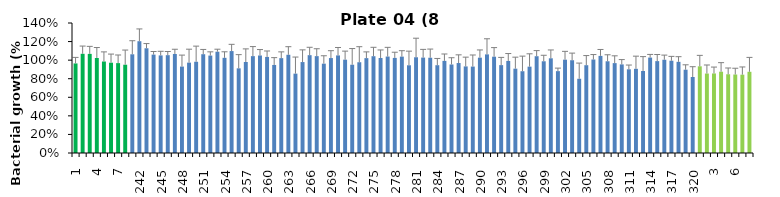
| Category | 8 h % |
|---|---|
| 1.0 | 0.965 |
| 2.0 | 1.068 |
| 3.0 | 1.067 |
| 4.0 | 1.023 |
| 5.0 | 0.985 |
| 6.0 | 0.972 |
| 7.0 | 0.968 |
| 8.0 | 0.951 |
| 241.0 | 1.063 |
| 242.0 | 1.204 |
| 243.0 | 1.128 |
| 244.0 | 1.06 |
| 245.0 | 1.051 |
| 246.0 | 1.054 |
| 247.0 | 1.067 |
| 248.0 | 0.931 |
| 249.0 | 0.973 |
| 250.0 | 0.983 |
| 251.0 | 1.064 |
| 252.0 | 1.049 |
| 253.0 | 1.091 |
| 254.0 | 1.025 |
| 255.0 | 1.098 |
| 256.0 | 0.912 |
| 257.0 | 0.98 |
| 258.0 | 1.043 |
| 259.0 | 1.05 |
| 260.0 | 1.035 |
| 261.0 | 0.948 |
| 262.0 | 1.022 |
| 263.0 | 1.058 |
| 264.0 | 0.855 |
| 265.0 | 0.979 |
| 266.0 | 1.054 |
| 267.0 | 1.043 |
| 268.0 | 0.962 |
| 269.0 | 1.022 |
| 270.0 | 1.051 |
| 271.0 | 1.005 |
| 272.0 | 0.951 |
| 273.0 | 0.978 |
| 274.0 | 1.022 |
| 275.0 | 1.042 |
| 276.0 | 1.023 |
| 277.0 | 1.039 |
| 278.0 | 1.024 |
| 279.0 | 1.038 |
| 280.0 | 0.945 |
| 281.0 | 1.031 |
| 282.0 | 1.028 |
| 283.0 | 1.026 |
| 284.0 | 0.946 |
| 285.0 | 0.992 |
| 286.0 | 0.953 |
| 287.0 | 0.969 |
| 288.0 | 0.933 |
| 289.0 | 0.931 |
| 290.0 | 1.027 |
| 291.0 | 1.062 |
| 292.0 | 1.037 |
| 293.0 | 0.946 |
| 294.0 | 0.991 |
| 295.0 | 0.908 |
| 296.0 | 0.881 |
| 297.0 | 0.93 |
| 298.0 | 1.042 |
| 299.0 | 0.988 |
| 300.0 | 1.02 |
| 301.0 | 0.882 |
| 302.0 | 1.005 |
| 303.0 | 0.999 |
| 304.0 | 0.799 |
| 305.0 | 0.946 |
| 306.0 | 1.007 |
| 307.0 | 1.046 |
| 308.0 | 0.988 |
| 309.0 | 0.968 |
| 310.0 | 0.954 |
| 311.0 | 0.901 |
| 312.0 | 0.907 |
| 313.0 | 0.883 |
| 314.0 | 1.028 |
| 315.0 | 0.99 |
| 316.0 | 1.004 |
| 317.0 | 0.994 |
| 318.0 | 0.982 |
| 319.0 | 0.897 |
| 320.0 | 0.818 |
| 1.0 | 0.933 |
| 2.0 | 0.856 |
| 3.0 | 0.857 |
| 4.0 | 0.876 |
| 5.0 | 0.848 |
| 6.0 | 0.845 |
| 7.0 | 0.844 |
| 8.0 | 0.875 |